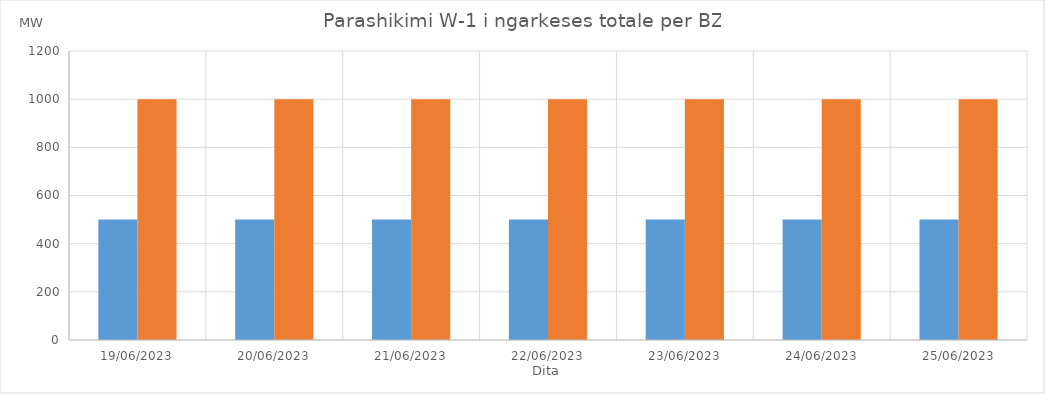
| Category | Min (MW) | Max (MW) |
|---|---|---|
| 19/06/2023 | 500 | 1000 |
| 20/06/2023 | 500 | 1000 |
| 21/06/2023 | 500 | 1000 |
| 22/06/2023 | 500 | 1000 |
| 23/06/2023 | 500 | 1000 |
| 24/06/2023 | 500 | 1000 |
| 25/06/2023 | 500 | 1000 |